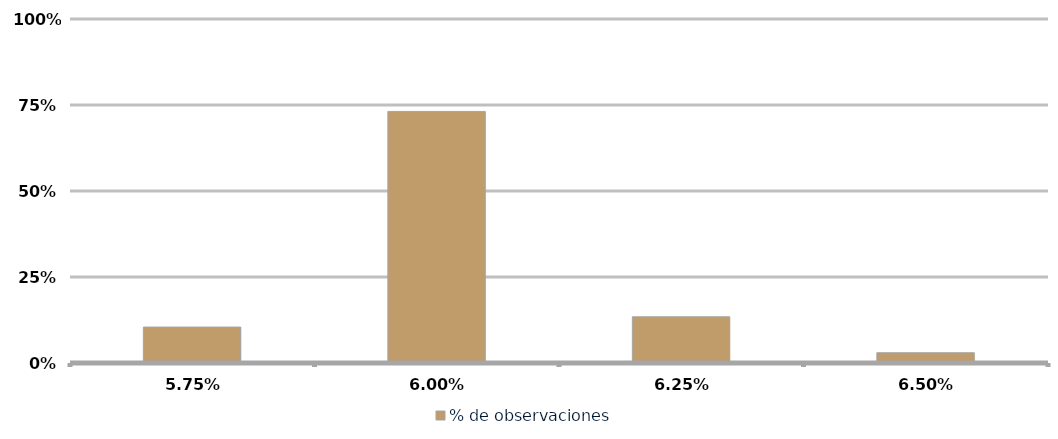
| Category | % de observaciones  |
|---|---|
| 0.057499999999999996 | 0.104 |
| 0.06 | 0.731 |
| 0.0625 | 0.134 |
| 0.065 | 0.03 |